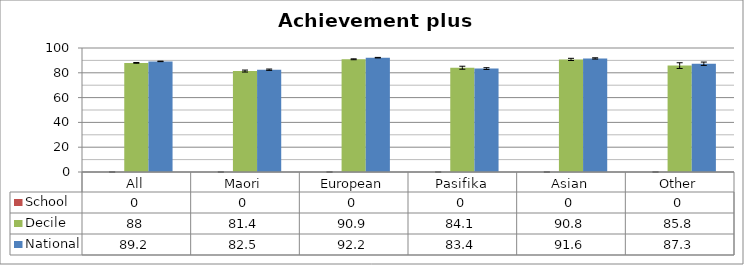
| Category | School | Decile | National |
|---|---|---|---|
| All | 0 | 88 | 89.2 |
| Maori | 0 | 81.4 | 82.5 |
| European | 0 | 90.9 | 92.2 |
| Pasifika | 0 | 84.1 | 83.4 |
| Asian | 0 | 90.8 | 91.6 |
| Other | 0 | 85.8 | 87.3 |